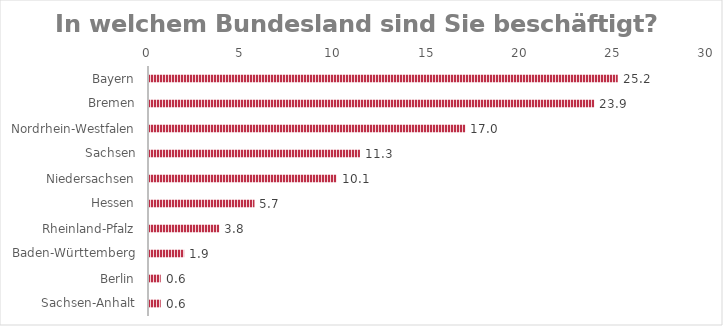
| Category | Gültige Prozente |
|---|---|
| Bayern | 25.157 |
| Bremen | 23.899 |
| Nordrhein-Westfalen | 16.981 |
| Sachsen | 11.321 |
| Niedersachsen | 10.063 |
| Hessen | 5.66 |
| Rheinland-Pfalz | 3.774 |
| Baden-Württemberg | 1.887 |
| Berlin | 0.629 |
| Sachsen-Anhalt | 0.629 |